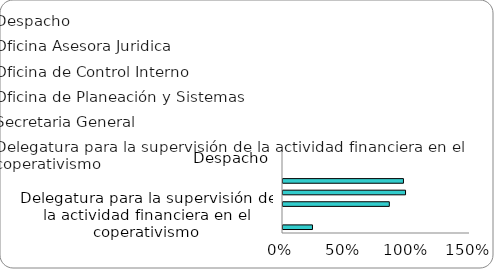
| Category | Series 0 |
|---|---|
| Despacho | 0 |
| Oficina Asesora Juridica | 0 |
| Oficina de Control Interno | 0.966 |
| Oficina de Planeación y Sistemas | 0.983 |
| Secretaria General | 0.853 |
| Delegatura para la supervisión de la actividad financiera en el coperativismo | 0 |
| Delegatura para la supervisión del ahorro y la forma asociativa soldaria. | 0.236 |